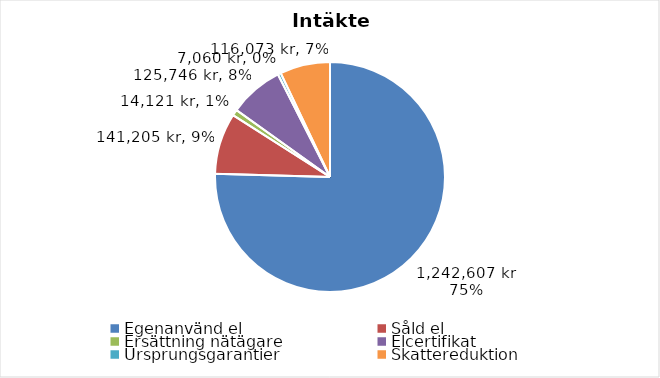
| Category | Series 0 |
|---|---|
| Egenanvänd el | 1242606.694 |
| Såld el | 141205.306 |
| Ersättning nätägare | 14120.531 |
| Elcertifikat | 125746.252 |
| Ursprungsgarantier | 7060.265 |
| Skattereduktion | 116073.464 |